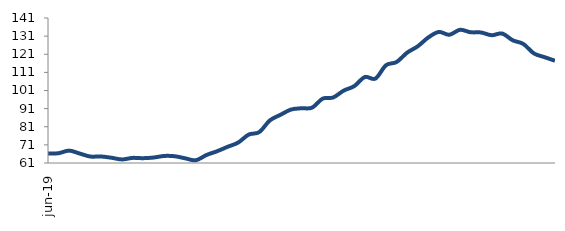
| Category | Series 0 |
|---|---|
| 2019-06-01 | 66.189 |
| 2019-07-01 | 66.392 |
| 2019-08-01 | 67.837 |
| 2019-09-01 | 66.22 |
| 2019-10-01 | 64.573 |
| 2019-11-01 | 64.608 |
| 2019-12-01 | 63.908 |
| 2020-01-01 | 62.959 |
| 2020-02-01 | 63.811 |
| 2020-03-01 | 63.665 |
| 2020-04-01 | 64.013 |
| 2020-05-01 | 64.885 |
| 2020-06-01 | 64.73 |
| 2020-07-01 | 63.568 |
| 2020-08-01 | 62.507 |
| 2020-09-01 | 65.409 |
| 2020-10-01 | 67.466 |
| 2020-11-01 | 69.929 |
| 2020-12-01 | 72.262 |
| 2021-01-01 | 76.667 |
| 2021-02-01 | 78.05 |
| 2021-03-01 | 84.474 |
| 2021-04-01 | 87.564 |
| 2021-05-01 | 90.47 |
| 2021-06-01 | 91.204 |
| 2021-07-01 | 91.538 |
| 2021-08-01 | 96.497 |
| 2021-09-01 | 97.152 |
| 2021-10-01 | 100.957 |
| 2021-11-01 | 103.422 |
| 2021-12-01 | 108.432 |
| 2022-01-01 | 107.584 |
| 2022-02-01 | 114.937 |
| 2022-03-01 | 116.708 |
| 2022-04-01 | 121.877 |
| 2022-05-01 | 125.358 |
| 2022-06-01 | 130.237 |
| 2022-07-01 | 133.304 |
| 2022-08-01 | 131.751 |
| 2022-09-01 | 134.487 |
| 2022-10-01 | 133.139 |
| 2022-11-01 | 133.012 |
| 2022-12-01 | 131.496 |
| 2023-01-01 | 132.43 |
| 2023-02-01 | 128.69 |
| 2023-03-01 | 126.696 |
| 2023-04-01 | 121.465 |
| 2023-05-01 | 119.417 |
| 2023-06-01 | 117.407 |